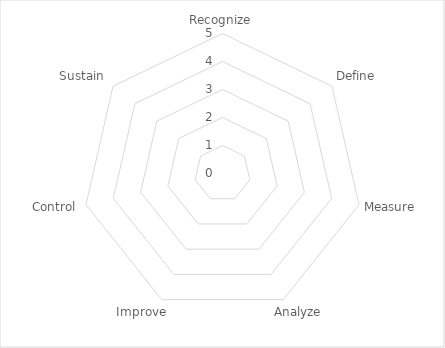
| Category | Score |
|---|---|
| Recognize | 0 |
| Define | 0 |
| Measure | 0 |
| Analyze | 0 |
| Improve | 0 |
| Control | 0 |
| Sustain | 0 |